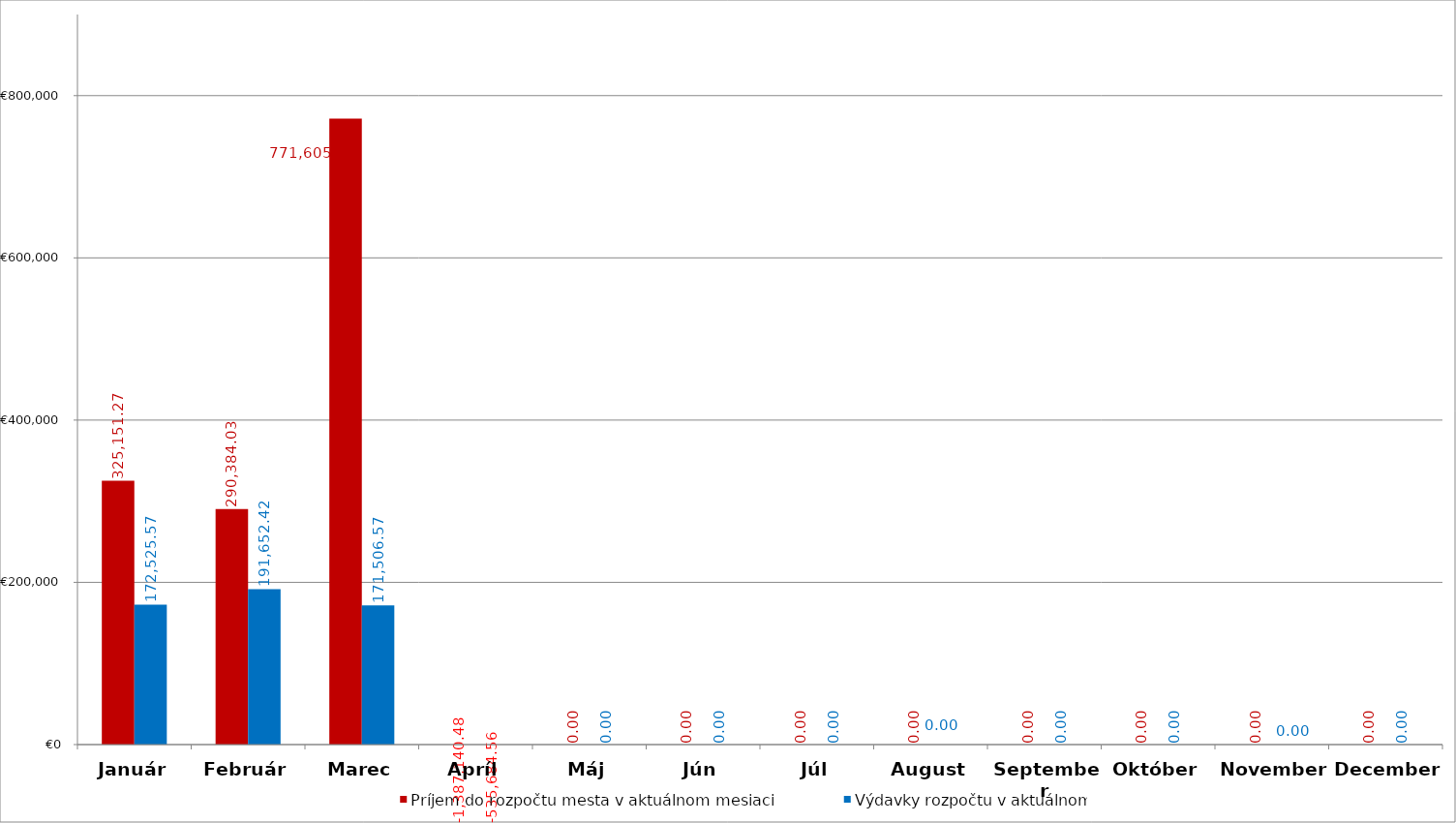
| Category | Príjem do rozpočtu mesta v aktuálnom mesiaci | Výdavky rozpočtu v aktuálnom  mesiaci |
|---|---|---|
| Január | 325151.27 | 172525.57 |
| Február | 290384.03 | 191652.42 |
| Marec | 771605.18 | 171506.57 |
| Apríl | -1387140.48 | -535684.56 |
| Máj | 0 | 0 |
| Jún | 0 | 0 |
| Júl | 0 | 0 |
| August | 0 | 0 |
| September | 0 | 0 |
| Október | 0 | 0 |
| November | 0 | 0 |
| December | 0 | 0 |